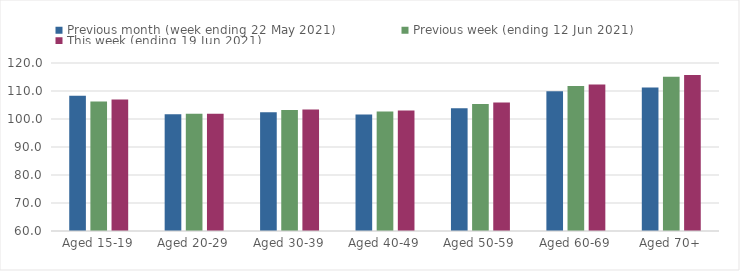
| Category | Previous month (week ending 22 May 2021) | Previous week (ending 12 Jun 2021) | This week (ending 19 Jun 2021) |
|---|---|---|---|
| Aged 15-19 | 108.27 | 106.28 | 106.92 |
| Aged 20-29 | 101.66 | 101.87 | 101.86 |
| Aged 30-39 | 102.44 | 103.17 | 103.37 |
| Aged 40-49 | 101.58 | 102.69 | 103.08 |
| Aged 50-59 | 103.83 | 105.33 | 105.92 |
| Aged 60-69 | 109.92 | 111.76 | 112.3 |
| Aged 70+ | 111.23 | 115.13 | 115.69 |